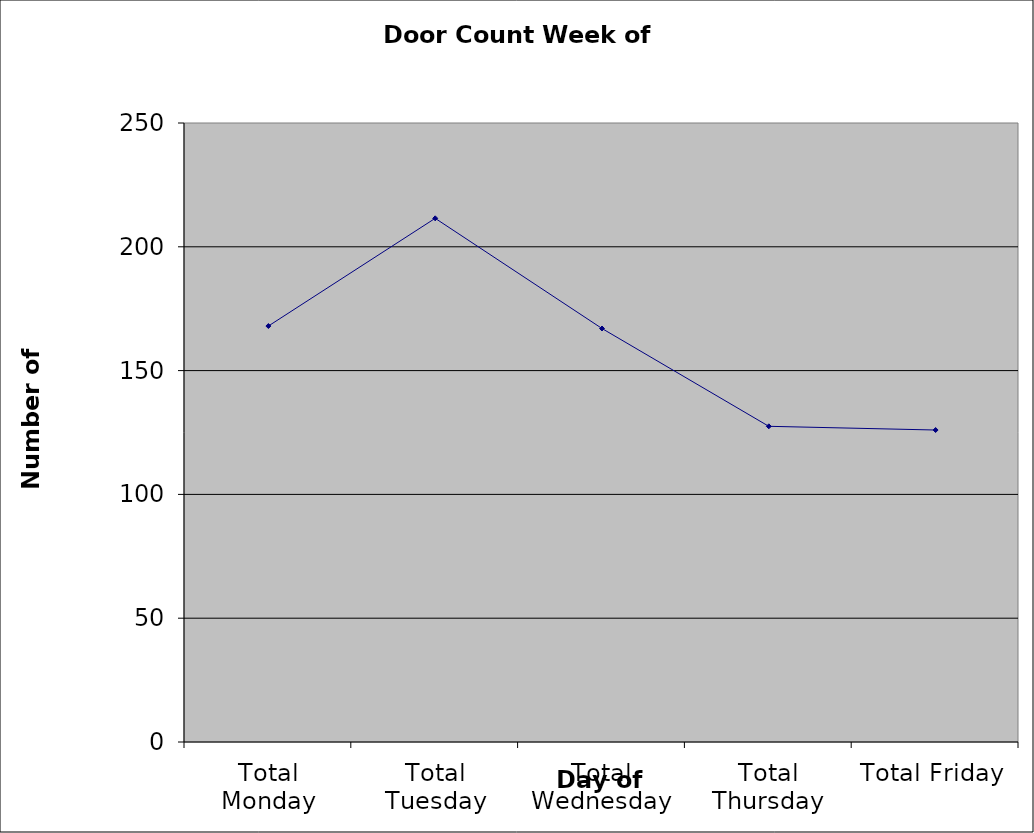
| Category | Series 0 |
|---|---|
| Total Monday | 168 |
| Total Tuesday | 211.5 |
| Total Wednesday | 167 |
| Total Thursday | 127.5 |
| Total Friday | 126 |